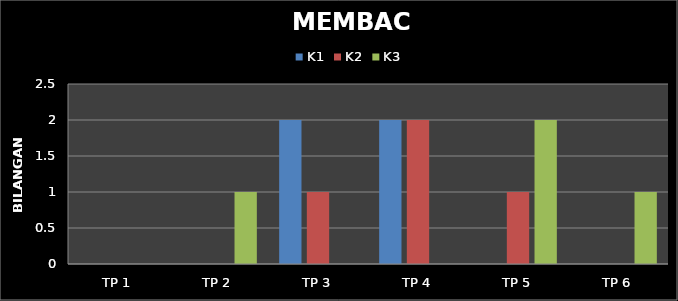
| Category | K1 | K2 | K3 |
|---|---|---|---|
| TP 1 | 0 | 0 | 0 |
| TP 2 | 0 | 0 | 1 |
| TP 3 | 2 | 1 | 0 |
| TP 4 | 2 | 2 | 0 |
| TP 5 | 0 | 1 | 2 |
| TP 6 | 0 | 0 | 1 |